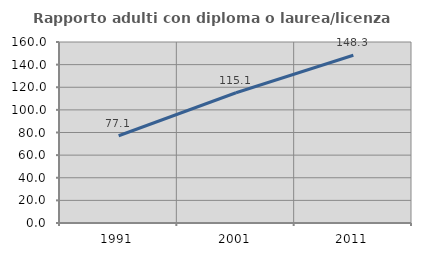
| Category | Rapporto adulti con diploma o laurea/licenza media  |
|---|---|
| 1991.0 | 77.124 |
| 2001.0 | 115.122 |
| 2011.0 | 148.306 |